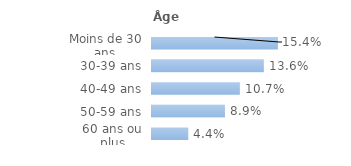
| Category | Series 0 |
|---|---|
| Moins de 30 ans | 0.154 |
| 30-39 ans | 0.136 |
| 40-49 ans | 0.107 |
| 50-59 ans | 0.089 |
| 60 ans ou plus | 0.044 |